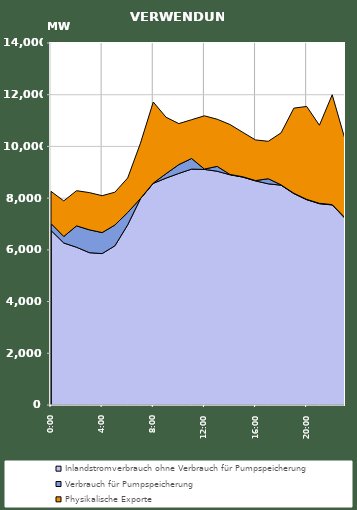
| Category | Inlandstromverbrauch ohne Verbrauch für Pumpspeicherung | Verbrauch für Pumpspeicherung | Physikalische Exporte |
|---|---|---|---|
| 2007-01-17 | 6750.944 | 268.055 | 1241.626 |
| 2007-01-17 01:00:00 | 6265.689 | 251.792 | 1376.649 |
| 2007-01-17 02:00:00 | 6100.26 | 828.022 | 1359.608 |
| 2007-01-17 03:00:00 | 5891.282 | 883.848 | 1439.428 |
| 2007-01-17 04:00:00 | 5854.93 | 813.191 | 1426.807 |
| 2007-01-17 05:00:00 | 6157.398 | 803.281 | 1269.646 |
| 2007-01-17 06:00:00 | 6967.287 | 477.708 | 1334.711 |
| 2007-01-17 07:00:00 | 7977.911 | 11.026 | 2138.243 |
| 2007-01-17 08:00:00 | 8571.365 | 11.249 | 3135.574 |
| 2007-01-17 09:00:00 | 8775.152 | 170.57 | 2184.352 |
| 2007-01-17 10:00:00 | 8955.65 | 341.62 | 1585.653 |
| 2007-01-17 11:00:00 | 9122.663 | 411.507 | 1499.937 |
| 2007-01-17 12:00:00 | 9111.68 | 13.098 | 2059.644 |
| 2007-01-17 13:00:00 | 9040.059 | 188.35 | 1823.35 |
| 2007-01-17 14:00:00 | 8904.5 | 12.866 | 1931.266 |
| 2007-01-17 15:00:00 | 8813.69 | 13.683 | 1719.428 |
| 2007-01-17 16:00:00 | 8666.894 | 13.517 | 1570.282 |
| 2007-01-17 17:00:00 | 8554.017 | 196.989 | 1447.773 |
| 2007-01-17 18:00:00 | 8500.8 | 12.437 | 2011.446 |
| 2007-01-17 19:00:00 | 8175.79 | 13.18 | 3291.825 |
| 2007-01-17 20:00:00 | 7941.118 | 12.831 | 3592.959 |
| 2007-01-17 21:00:00 | 7785.382 | 15.267 | 3019.199 |
| 2007-01-17 22:00:00 | 7737.527 | 12.75 | 4248.359 |
| 2007-01-17 23:00:00 | 7218.507 | 23.387 | 3035.894 |